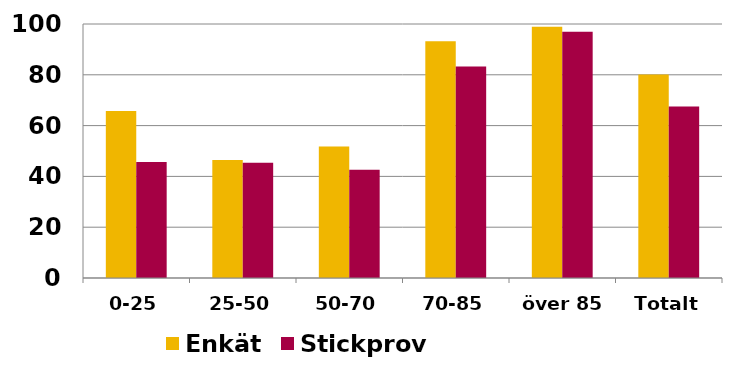
| Category | Enkät | Stickprov |
|---|---|---|
| 0-25 | 65.714 | 45.703 |
| 25-50 | 46.479 | 45.406 |
| 50-70 | 51.724 | 42.656 |
| 70-85 | 93.187 | 83.235 |
| över 85 | 98.876 | 96.909 |
| Totalt | 80.16 | 67.527 |